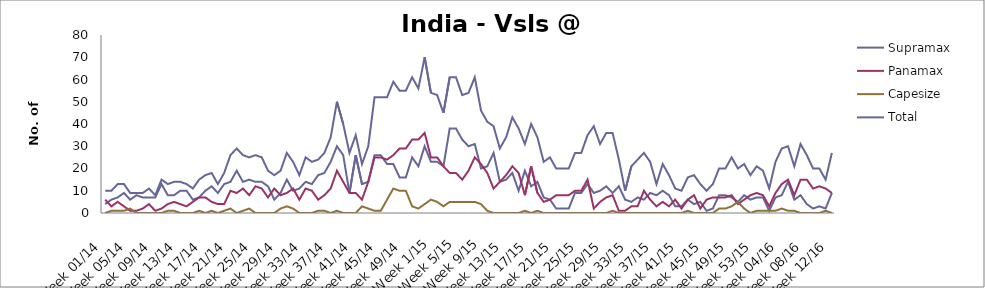
| Category | Supramax | Panamax | Capesize | Total |
|---|---|---|---|---|
| Week 01/14 | 4 | 6 | 0 | 10 |
| Week 02/14 | 6 | 3 | 1 | 10 |
| Week 03/14 | 7 | 5 | 1 | 13 |
| Week 04/14 | 9 | 3 | 1 | 13 |
| Week 05/14 | 6 | 1 | 2 | 9 |
| Week 06/14 | 8 | 1 | 0 | 9 |
| Week 07/14 | 7 | 2 | 0 | 9 |
| Week 08/14 | 7 | 4 | 0 | 11 |
| Week 09/14 | 7 | 1 | 0 | 8 |
| Week 10/14 | 13 | 2 | 0 | 15 |
| Week 11/14 | 8 | 4 | 1 | 13 |
| Week 12/14 | 8 | 5 | 1 | 14 |
| Week 13/14 | 10 | 4 | 0 | 14 |
| Week 14/14 | 10 | 3 | 0 | 13 |
| Week 15/14 | 6 | 5 | 0 | 11 |
| Week 16/14 | 7 | 7 | 1 | 15 |
| Week 17/14 | 10 | 7 | 0 | 17 |
| Week 18/14 | 12 | 5 | 1 | 18 |
| Week 19/14 | 9 | 4 | 0 | 13 |
| Week 20/14 | 13 | 4 | 1 | 18 |
| Week 21/14 | 14 | 10 | 2 | 26 |
| Week 22/14 | 19 | 9 | 0 | 29 |
| Week 23/14 | 14 | 11 | 1 | 26 |
| Week 24/14 | 15 | 8 | 2 | 25 |
| Week 25/14 | 14 | 12 | 0 | 26 |
| Week 26/14 | 14 | 11 | 0 | 25 |
| Week 27/14 | 12 | 7 | 0 | 19 |
| Week 28/14 | 6 | 11 | 0 | 17 |
| Week 29/14 | 9 | 8 | 2 | 19 |
| Week 30/14 | 15 | 9 | 3 | 27 |
| Week 31/14 | 10 | 11 | 2 | 23 |
| Week 32/14 | 11 | 6 | 0 | 17 |
| Week 33/14 | 14 | 11 | 0 | 25 |
| Week 34/14 | 13 | 10 | 0 | 23 |
| Week 35/14 | 17 | 6 | 1 | 24 |
| Week 36/14 | 18 | 8 | 1 | 27 |
| Week 37/14 | 23 | 11 | 0 | 34 |
| Week 38/14 | 30 | 19 | 1 | 50 |
| Week 39/14 | 26 | 14 | 0 | 40 |
| Week 40/14 | 9 | 9 | 0 | 27 |
| Week 41/14 | 26 | 9 | 0 | 35 |
| Week 42/14 | 13 | 6 | 3 | 22 |
| Week 43/14 | 14 | 14 | 2 | 30 |
| Week 44/14 | 26 | 25 | 1 | 52 |
| Week 45/14 | 26 | 25 | 1 | 52 |
| Week 46/14 | 22 | 24 | 6 | 52 |
| Week 47/14 | 22 | 26 | 11 | 59 |
| Week 48/14 | 16 | 29 | 10 | 55 |
| Week 49/14 | 16 | 29 | 10 | 55 |
| Week 50/14 | 25 | 33 | 3 | 61 |
| Week 51/14 | 21 | 33 | 2 | 56 |
| Week 52/14 | 30 | 36 | 4 | 70 |
| Week 1/15 | 23 | 25 | 6 | 54 |
| Week 2/15 | 23 | 25 | 5 | 53 |
| Week 3/15 | 21 | 21 | 3 | 45 |
| Week 4/15 | 38 | 18 | 5 | 61 |
| Week 5/15 | 38 | 18 | 5 | 61 |
| Week 6/15 | 33 | 15 | 5 | 53 |
| Week 7/15 | 30 | 19 | 5 | 54 |
| Week 8/15 | 31 | 25 | 5 | 61 |
| Week 9/15 | 20 | 22 | 4 | 46 |
| Week 10/15 | 21 | 18 | 1 | 41 |
| Week 11/15 | 27 | 11 | 0 | 39 |
| Week 12/15 | 14 | 14 | 0 | 29 |
| Week 13/15 | 15 | 17 | 0 | 34 |
| Week 14/15 | 18 | 21 | 0 | 43 |
| Week 15/15 | 10 | 18 | 0 | 38 |
| Week 16/15 | 19 | 8 | 1 | 31 |
| Week 17/15 | 12 | 21 | 0 | 40 |
| Week 18/15 | 14 | 9 | 1 | 34 |
| Week 19/15 | 7 | 5 | 0 | 23 |
| Week 20/15 | 6 | 6 | 0 | 25 |
| Week 21/15 | 2 | 8 | 0 | 20 |
| Week 22/15 | 2 | 8 | 0 | 20 |
| Week 23/15 | 2 | 8 | 0 | 20 |
| Week 24/15 | 9 | 10 | 0 | 27 |
| Week 25/15 | 9 | 10 | 0 | 27 |
| Week 26/15 | 13 | 15 | 0 | 35 |
| Week 27/15 | 9 | 2 | 0 | 39 |
| Week 28/15 | 10 | 5 | 0 | 31 |
| Week 29/15 | 12 | 7 | 0 | 36 |
| Week 30/15 | 9 | 8 | 1 | 36 |
| Week 31/15 | 12 | 1 | 0 | 24 |
| Week 32/15 | 6 | 1 | 0 | 10 |
| Week 33/15 | 5 | 3 | 0 | 21 |
| Week 34/15 | 7 | 3 | 0 | 24 |
| Week 35/15 | 6 | 10 | 0 | 27 |
| Week 36/15 | 9 | 6 | 0 | 23 |
| Week 37/15 | 8 | 3 | 0 | 13 |
| Week 38/15 | 10 | 5 | 0 | 22 |
| Week 39/15 | 8 | 3 | 0 | 17 |
| Week 40/15 | 3 | 6 | 0 | 11 |
| Week 41/15 | 3 | 2 | 0 | 10 |
| Week 42/15 | 6 | 6 | 1 | 16 |
| Week 43/15 | 4 | 8 | 0 | 17 |
| Week 44/15 | 5 | 2 | 0 | 13 |
| Week 45/15 | 1 | 6 | 0 | 10 |
| Week 46/15 | 2 | 7 | 0 | 13 |
| Week 47/15 | 8 | 7 | 2 | 20 |
| Week 48/15 | 8 | 7 | 2 | 20 |
| Week 49/15 | 7 | 8 | 3 | 25 |
| Week 50/15 | 5 | 4 | 5 | 20 |
| Week 51/15 | 8 | 6 | 2 | 22 |
| Week 52/15 | 6 | 8 | 0 | 17 |
| Week 53/15 | 7 | 9 | 1 | 21 |
| Week 01/16 | 7 | 8 | 1 | 19 |
| Week 02/16 | 1 | 3 | 1 | 11 |
| Week 03/16 | 7 | 9 | 1 | 23 |
| Week 04/16 | 8 | 13 | 2 | 29 |
| Week 05/16 | 14 | 15 | 1 | 30 |
| Week 06/16 | 6 | 8 | 1 | 21 |
| Week 07/16 | 8 | 15 | 0 | 31 |
| Week 08/16 | 4 | 15 | 0 | 26 |
| Week 09/16 | 2 | 11 | 0 | 20 |
| Week 10/16 | 3 | 12 | 0 | 20 |
| Week 11/16 | 2 | 11 | 1 | 15 |
| Week 12/16 | 9 | 9 | 0 | 27 |